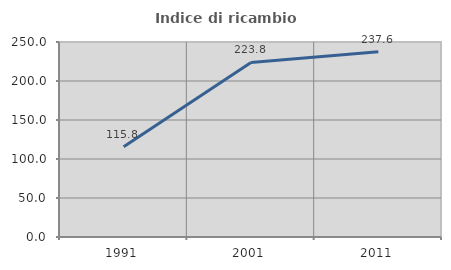
| Category | Indice di ricambio occupazionale  |
|---|---|
| 1991.0 | 115.827 |
| 2001.0 | 223.786 |
| 2011.0 | 237.594 |